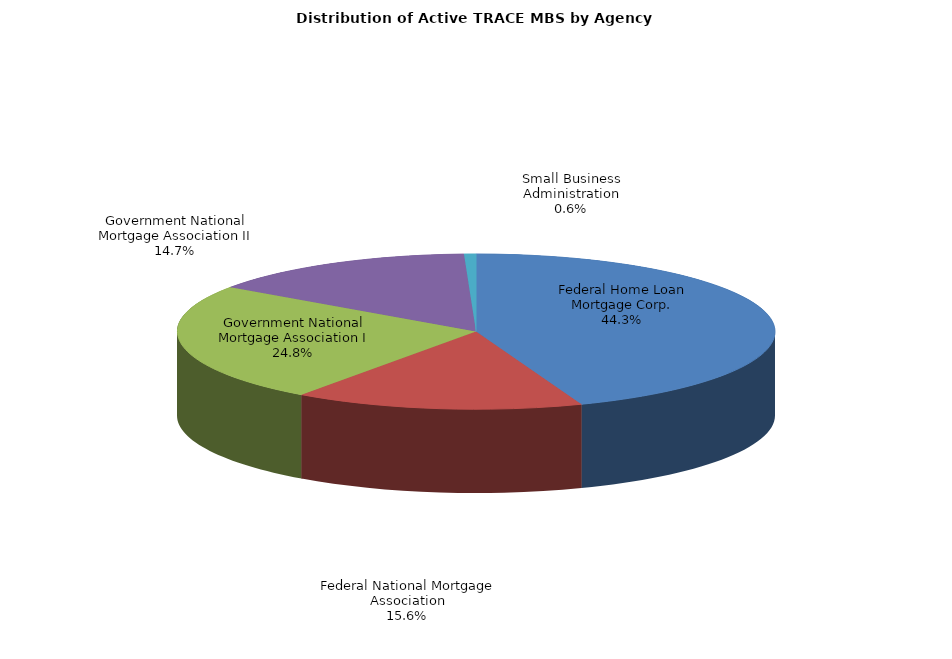
| Category | Series 0 |
|---|---|
| Federal Home Loan Mortgage Corp. | 288163 |
| Federal National Mortgage Association | 101849 |
| Government National Mortgage Association I | 161268 |
| Government National Mortgage Association II | 95489 |
| Small Business Administration | 4187 |